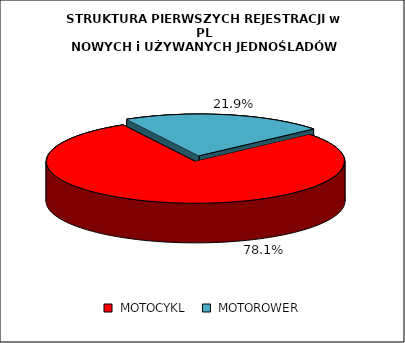
| Category | RAZEM |
|---|---|
|  MOTOCYKL  | 0.781 |
|  MOTOROWER  | 0.219 |